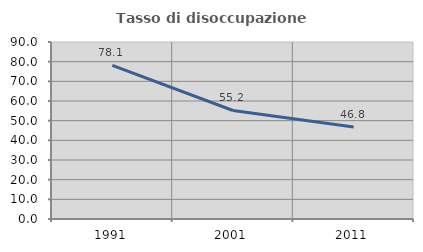
| Category | Tasso di disoccupazione giovanile  |
|---|---|
| 1991.0 | 78.102 |
| 2001.0 | 55.172 |
| 2011.0 | 46.809 |